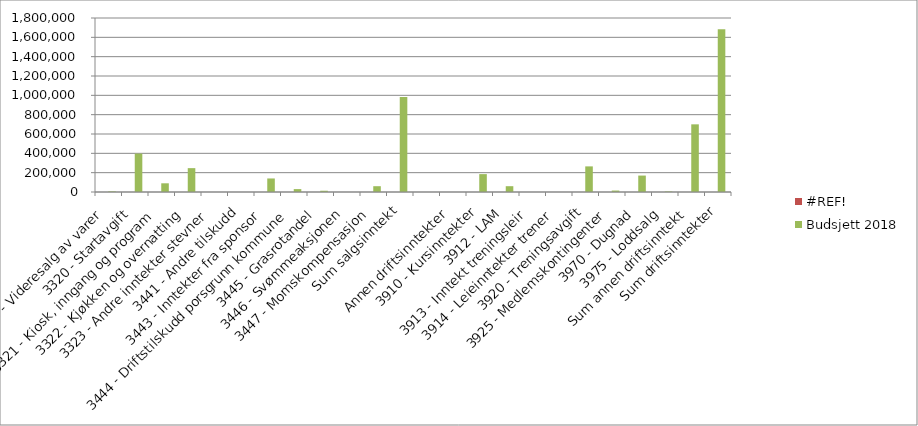
| Category | #REF! | Budsjett 2018 |
|---|---|---|
| 3300 - Videresalg av varer | 0 | 6000 |
| 3320 - Startavgift | 0 | 397200 |
| 3321 - Kiosk, inngang og program | 0 | 90000 |
| 3322 - Kjøkken og overnatting | 0 | 246790 |
| 3323 - Andre inntekter stevner | 0 | 0 |
| 3441 - Andre tilskudd | 0 | 0 |
| 3443 - Inntekter fra sponsor | 0 | 140000 |
| 3444 - Driftstilskudd porsgrunn kommune | 0 | 30000 |
| 3445 - Grasrotandel | 0 | 13000 |
| 3446 - Svømmeaksjonen | 0 | 0 |
| 3447 - Momskompensasjon | 0 | 60000 |
| Sum salgsinntekt | 0 | 982990 |
|  | 0 | 0 |
| Annen driftsinntekter | 0 | 0 |
| 3910 - Kursinntekter | 0 | 185000 |
| 3912 - LAM | 0 | 60000 |
| 3913 - Inntekt treningsleir | 0 | 0 |
| 3914 - Leieinntekter trener | 0 | 0 |
| 3920 - Treningsavgift | 0 | 265000 |
| 3925 - Medlemskontingenter | 0 | 15000 |
| 3970 - Dugnad | 0 | 170000 |
| 3975 - Loddsalg | 0 | 5000 |
| Sum annen driftsinntekt | 0 | 700000 |
| Sum driftsinntekter | 0 | 1682990 |